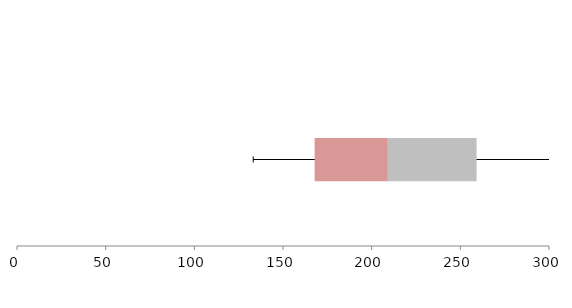
| Category | Series 1 | Series 2 | Series 3 |
|---|---|---|---|
| 0 | 167.839 | 41.28 | 50.031 |